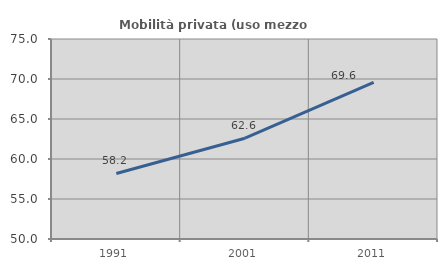
| Category | Mobilità privata (uso mezzo privato) |
|---|---|
| 1991.0 | 58.191 |
| 2001.0 | 62.602 |
| 2011.0 | 69.569 |